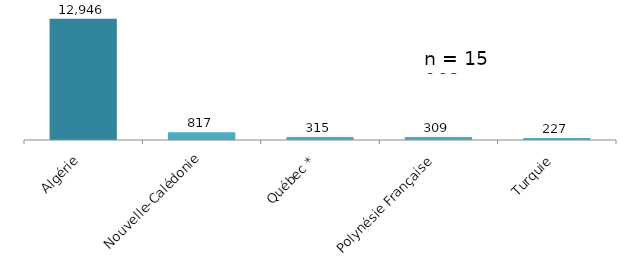
| Category | Series 0 |
|---|---|
| Algérie | 12946 |
| Nouvelle-Calédonie | 817 |
| Québec * | 315 |
| Polynésie Française | 309 |
| Turquie | 227 |